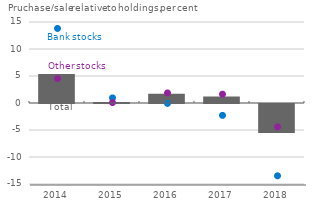
| Category | Stocks, total |
|---|---|
| 2014.0 | 5.375 |
| 2015.0 | 0.177 |
| 2016.0 | 1.695 |
| 2017.0 | 1.182 |
| 2018.0 | -5.382 |